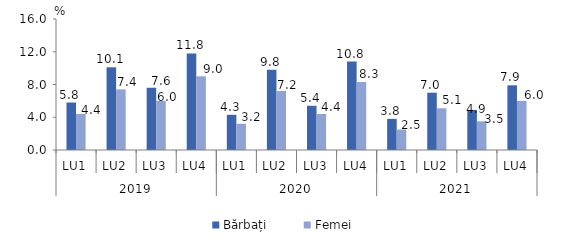
| Category | Bărbați | Femei |
|---|---|---|
| 0 | 5.8 | 4.4 |
| 1 | 10.1 | 7.4 |
| 2 | 7.6 | 6 |
| 3 | 11.8 | 9 |
| 4 | 4.3 | 3.2 |
| 5 | 9.8 | 7.2 |
| 6 | 5.4 | 4.4 |
| 7 | 10.8 | 8.3 |
| 8 | 3.8 | 2.5 |
| 9 | 7 | 5.1 |
| 10 | 4.9 | 3.5 |
| 11 | 7.9 | 6 |